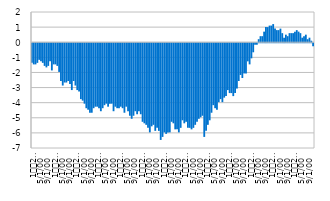
| Category | Fiscal result |
|---|---|
| 1
2007 | -1.3 |
| 2 | -1.4 |
| 3 | -1.4 |
| 4 | -1.3 |
| 5 | -1.1 |
| 6 | -1.2 |
| 7 | -1.3 |
| 8 | -1.5 |
| 9 | -1.6 |
| 10 | -1.5 |
| 11 | -1.2 |
| 12 | -1.8 |
| 1
2008 | -1.4 |
| 2 | -1.4 |
| 3 | -1.5 |
| 4 | -1.9 |
| 5 | -2.5 |
| 6 | -2.8 |
| 7 | -2.6 |
| 8 | -2.6 |
| 9 | -2.5 |
| 10 | -2.7 |
| 11 | -3.1 |
| 12 | -2.5 |
| 1
2009 | -2.8 |
| 2 | -3.1 |
| 3 | -3.2 |
| 4 | -3.7 |
| 5 | -3.8 |
| 6 | -4 |
| 7 | -4.3 |
| 8 | -4.4 |
| 9 | -4.6 |
| 10 | -4.6 |
| 11 | -4.3 |
| 12 | -4.2 |
| 1
2010 | -4.2 |
| 2 | -4.3 |
| 3 | -4.5 |
| 4 | -4.3 |
| 5 | -4.1 |
| 6 | -4 |
| 7 | -4.2 |
| 8 | -4 |
| 9 | -4 |
| 10 | -4.5 |
| 11 | -4.2 |
| 12 | -4.3 |
| 1
2011 | -4.3 |
| 2 | -4.2 |
| 3 | -4.3 |
| 4 | -4.6 |
| 5 | -4.2 |
| 6 | -4.5 |
| 7 | -4.8 |
| 8 | -5 |
| 9 | -4.8 |
| 10 | -4.5 |
| 11 | -4.7 |
| 12 | -4.5 |
| 1
2012 | -4.7 |
| 2 | -5.2 |
| 3 | -5.3 |
| 4 | -5.4 |
| 5 | -5.6 |
| 6 | -5.9 |
| 7 | -5.5 |
| 8 | -5.4 |
| 9 | -5.8 |
| 10 | -5.6 |
| 11 | -5.8 |
| 12 | -6.4 |
| 1
2013 | -6.2 |
| 2 | -5.9 |
| 3 | -6 |
| 4 | -5.9 |
| 5 | -5.9 |
| 6 | -5.2 |
| 7 | -5.3 |
| 8 | -5.7 |
| 9 | -5.7 |
| 10 | -5.9 |
| 11 | -5.6 |
| 12 | -5.1 |
| 1
2014 | -5.3 |
| 2 | -5.2 |
| 3 | -5.6 |
| 4 | -5.6 |
| 5 | -5.7 |
| 6 | -5.6 |
| 7 | -5.4 |
| 8 | -5.2 |
| 9 | -5 |
| 10 | -4.9 |
| 11 | -4.8 |
| 12 | -6.2 |
| 1
2015 | -5.8 |
| 2 | -5.4 |
| 3 | -5.1 |
| 4 | -4.6 |
| 5 | -4.1 |
| 6 | -4.3 |
| 7 | -4.4 |
| 8 | -3.9 |
| 9 | -3.7 |
| 10 | -3.9 |
| 11 | -3.6 |
| 12 | -3.5 |
| 1
2016 | -3.1 |
| 2 | -3.3 |
| 3 | -3.3 |
| 4 | -3.5 |
| 5 | -3.3 |
| 6 | -3 |
| 7 | -2.5 |
| 8 | -2.1 |
| 9 | -2.3 |
| 10 | -2 |
| 11 | -2 |
| 12 | -1.2 |
| 1
2017 | -1.4 |
| 2 | -1 |
| 3 | -0.6 |
| 4 | -0.1 |
| 5 | -0.1 |
| 6 | 0.2 |
| 7 | 0.4 |
| 8 | 0.4 |
| 9 | 0.7 |
| 10 | 1 |
| 11 | 1 |
| 12 | 1.1 |
| 1
2018 | 1.1 |
| 2 | 1.2 |
| 3 | 0.9 |
| 4 | 0.8 |
| 5 | 0.8 |
| 6 | 0.9 |
| 7 | 0.6 |
| 8 | 0.3 |
| 9 | 0.5 |
| 10 | 0.4 |
| 11 | 0.6 |
| 12 | 0.6 |
| 1
2019 | 0.6 |
| 2 | 0.7 |
| 3 | 0.8 |
| 4 | 0.7 |
| 5 | 0.6 |
| 6 | 0.3 |
| 7 | 0.4 |
| 8 | 0.5 |
| 9 | 0.2 |
| 10 | 0.3 |
| 11 | 0.1 |
| 12 | -0.2 |